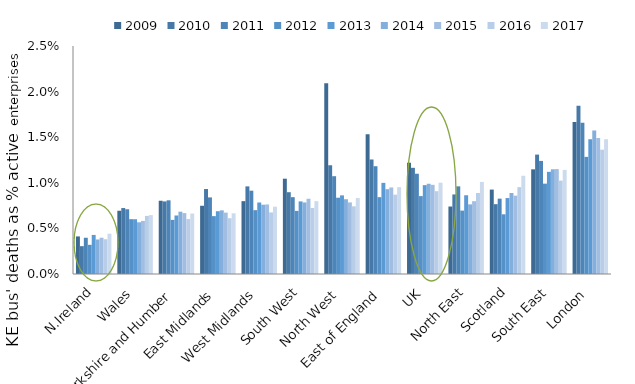
| Category | 2009 | 2010 | 2011 | 2012 | 2013 | 2014 | 2015 | 2016 | 2017 |
|---|---|---|---|---|---|---|---|---|---|
| N.Ireland | 0.004 | 0.003 | 0.004 | 0.003 | 0.004 | 0.004 | 0.004 | 0.004 | 0.004 |
| Wales | 0.007 | 0.007 | 0.007 | 0.006 | 0.006 | 0.006 | 0.006 | 0.006 | 0.006 |
| Yorkshire and Humber | 0.008 | 0.008 | 0.008 | 0.006 | 0.006 | 0.007 | 0.007 | 0.006 | 0.007 |
| East Midlands | 0.007 | 0.009 | 0.008 | 0.006 | 0.007 | 0.007 | 0.007 | 0.006 | 0.007 |
| West Midlands | 0.008 | 0.01 | 0.009 | 0.007 | 0.008 | 0.008 | 0.008 | 0.007 | 0.007 |
| South West | 0.01 | 0.009 | 0.008 | 0.007 | 0.008 | 0.008 | 0.008 | 0.007 | 0.008 |
| North West | 0.021 | 0.012 | 0.011 | 0.008 | 0.009 | 0.008 | 0.008 | 0.007 | 0.008 |
| East of England | 0.015 | 0.013 | 0.012 | 0.008 | 0.01 | 0.009 | 0.009 | 0.009 | 0.01 |
| UK | 0.012 | 0.012 | 0.011 | 0.009 | 0.01 | 0.01 | 0.01 | 0.009 | 0.01 |
| North East | 0.007 | 0.009 | 0.01 | 0.007 | 0.009 | 0.008 | 0.008 | 0.009 | 0.01 |
| Scotland | 0.009 | 0.008 | 0.008 | 0.007 | 0.008 | 0.009 | 0.009 | 0.01 | 0.011 |
| South East | 0.011 | 0.013 | 0.012 | 0.01 | 0.011 | 0.011 | 0.012 | 0.01 | 0.011 |
| London | 0.017 | 0.018 | 0.017 | 0.013 | 0.015 | 0.016 | 0.015 | 0.014 | 0.015 |